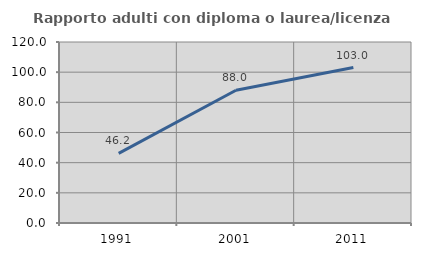
| Category | Rapporto adulti con diploma o laurea/licenza media  |
|---|---|
| 1991.0 | 46.154 |
| 2001.0 | 88 |
| 2011.0 | 103.03 |